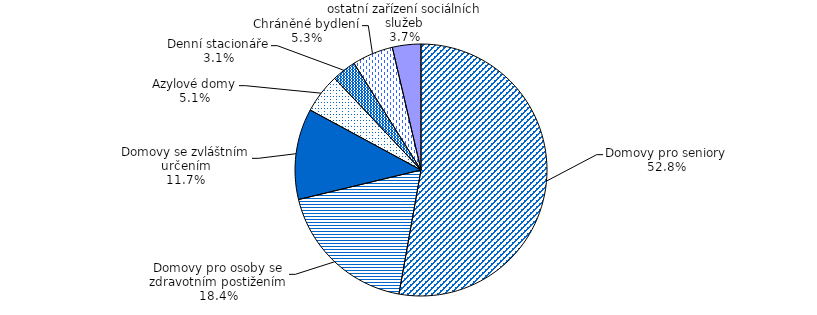
| Category | Series 0 |
|---|---|
| Domovy pro seniory | 2195 |
| Domovy pro osoby se zdravotním postižením | 766 |
| Domovy se zvláštním určením | 485 |
| Azylové domy | 211 |
| Denní stacionáře | 129 |
| Chráněné bydlení | 219 |
| ostatní zařízení sociálních služeb | 152 |